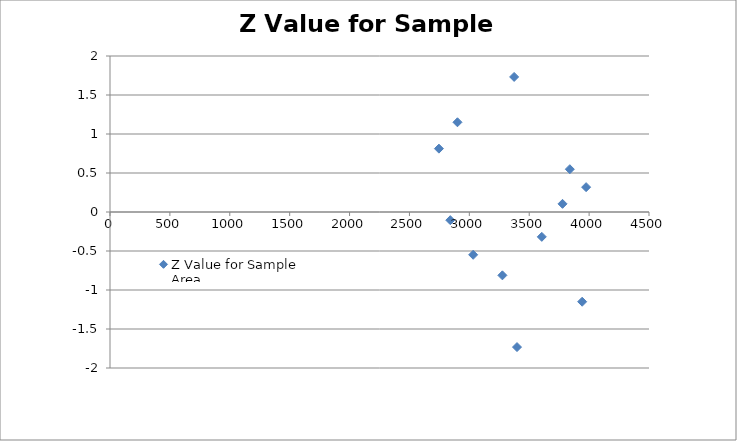
| Category | Z Value for Sample Area |
|---|---|
| 3398.0 | -1.732 |
| 3942.0 | -1.15 |
| 3276.0 | -0.812 |
| 3032.0 | -0.549 |
| 3605.0 | -0.319 |
| 2841.0 | -0.105 |
| 3778.0 | 0.105 |
| 3975.0 | 0.319 |
| 3839.0 | 0.549 |
| 2746.0 | 0.812 |
| 2901.0 | 1.15 |
| 3374.0 | 1.732 |